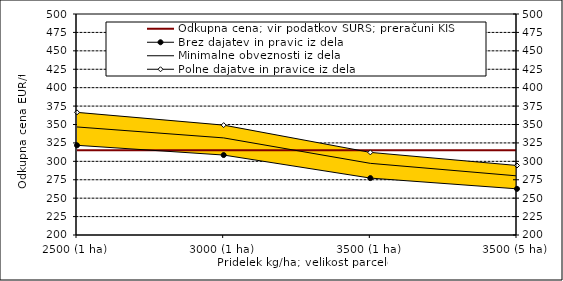
| Category | Odkupna cena; vir podatkov SURS; preračuni KIS |
|---|---|
| 2500 (1 ha) | 315 |
| 3000 (1 ha) | 315 |
| 3500 (1 ha) | 315 |
| 3500 (5 ha) | 315 |